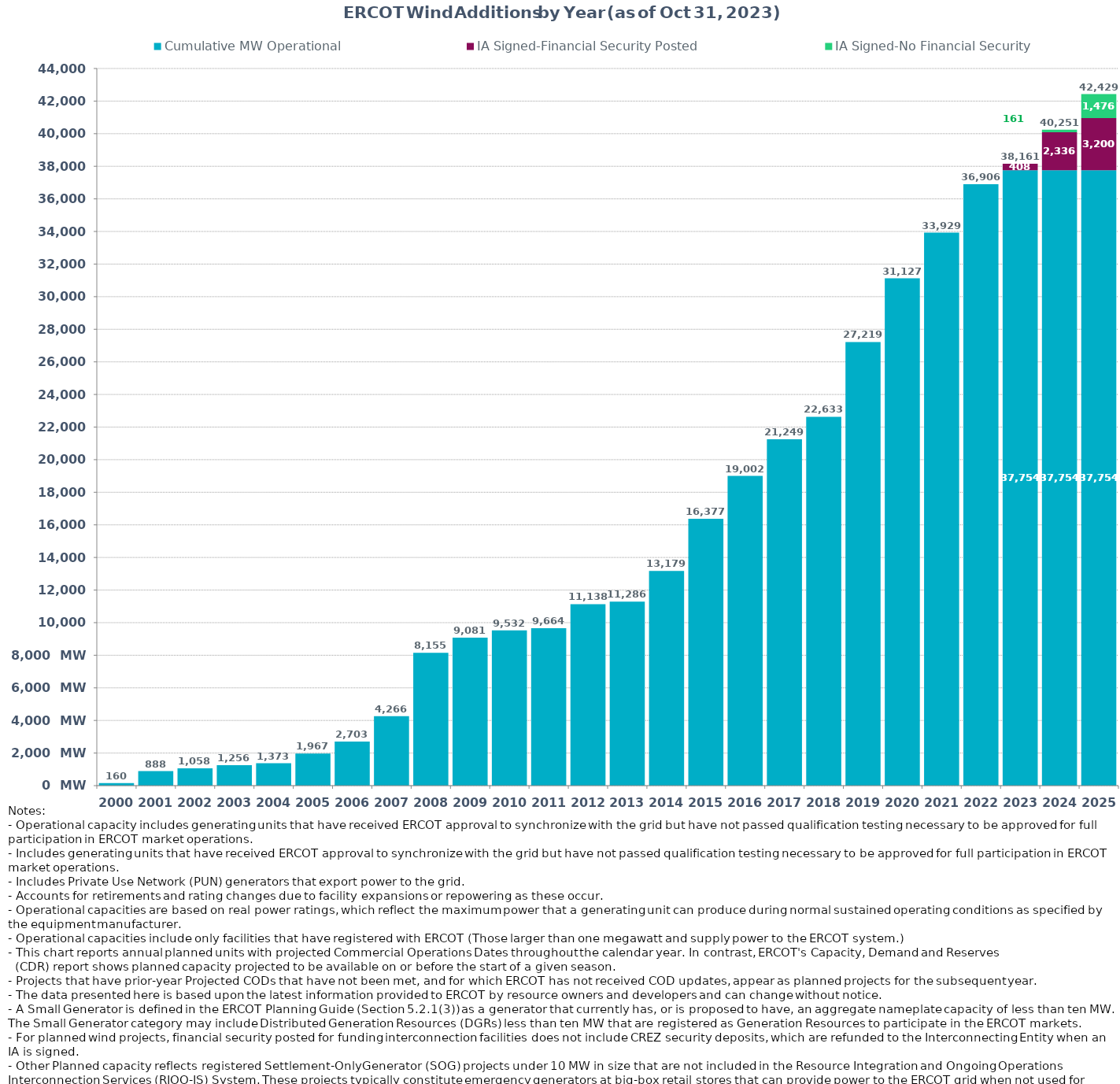
| Category | Cumulative MW Operational | IA Signed-Financial Security Posted  | IA Signed-No Financial Security  | Other Planned | Cumulative Installed and Planned |
|---|---|---|---|---|---|
| 2000.0 | 160.37 | 0 | 0 | 0 | 160.37 |
| 2001.0 | 887.97 | 0 | 0 | 0 | 887.97 |
| 2002.0 | 1058.22 | 0 | 0 | 0 | 1058.22 |
| 2003.0 | 1255.72 | 0 | 0 | 0 | 1255.72 |
| 2004.0 | 1372.82 | 0 | 0 | 0 | 1372.82 |
| 2005.0 | 1967.04 | 0 | 0 | 0 | 1967.04 |
| 2006.0 | 2703.34 | 0 | 0 | 0 | 2703.34 |
| 2007.0 | 4266.36 | 0 | 0 | 0 | 4266.36 |
| 2008.0 | 8154.76 | 0 | 0 | 0 | 8154.76 |
| 2009.0 | 9080.78 | 0 | 0 | 0 | 9080.78 |
| 2010.0 | 9531.7 | 0 | 0 | 0 | 9531.7 |
| 2011.0 | 9663.7 | 0 | 0 | 0 | 9663.7 |
| 2012.0 | 11137.66 | 0 | 0 | 0 | 11137.66 |
| 2013.0 | 11286.26 | 0 | 0 | 0 | 11286.26 |
| 2014.0 | 13178.84 | 0 | 0 | 0 | 13178.84 |
| 2015.0 | 16376.53 | 0 | 0 | 0 | 16376.53 |
| 2016.0 | 19001.85 | 0 | 0 | 0 | 19001.85 |
| 2017.0 | 21248.99 | 0 | 0 | 0 | 21248.99 |
| 2018.0 | 22632.69 | 0 | 0 | 0 | 22632.69 |
| 2019.0 | 27219.34 | 0 | 0 | 0 | 27219.34 |
| 2020.0 | 31127.31 | 0 | 0 | 0 | 31127.31 |
| 2021.0 | 33928.91 | 0 | 0 | 0 | 33928.91 |
| 2022.0 | 36906.07 | 0 | 0 | 0 | 36906.07 |
| 2023.0 | 37753.63 | 407.72 | 0 | 0 | 38161.35 |
| 2024.0 | 37753.63 | 2335.64 | 161.26 | 0 | 40250.53 |
| 2025.0 | 37753.63 | 3199.72 | 1476.13 | 0 | 42429.48 |